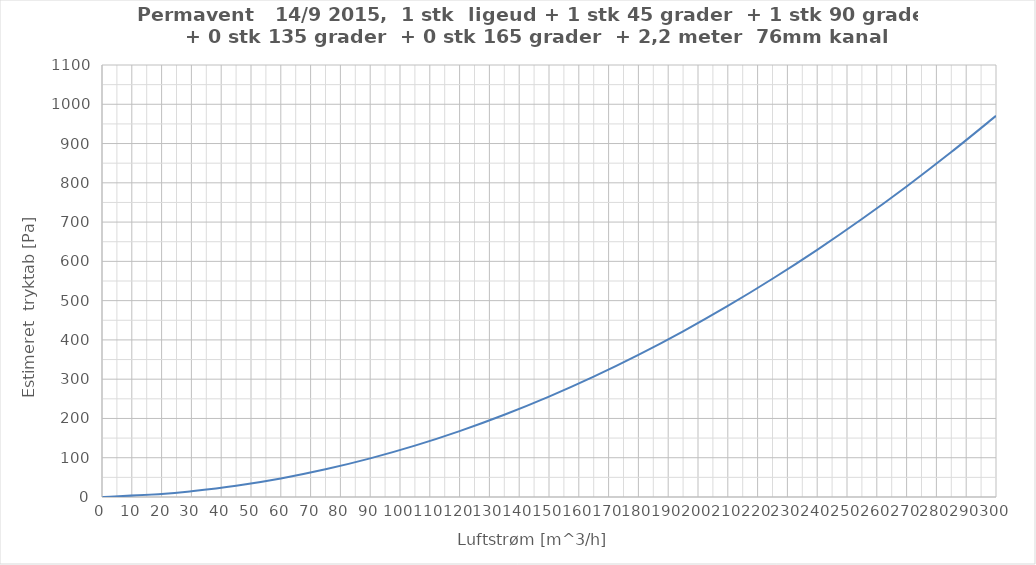
| Category | Series 0 |
|---|---|
| 0.0 | 0 |
| 20.0 | 7.552 |
| 30.0 | 14.39 |
| 45.0 | 28.473 |
| 60.0 | 47.148 |
| 75.0 | 70.416 |
| 90.0 | 98.275 |
| 105.0 | 130.727 |
| 120.0 | 167.772 |
| 135.0 | 209.408 |
| 150.0 | 255.636 |
| 165.0 | 306.457 |
| 180.0 | 361.87 |
| 195.0 | 421.875 |
| 210.0 | 486.472 |
| 225.0 | 555.662 |
| 240.0 | 629.443 |
| 255.0 | 707.817 |
| 270.0 | 790.783 |
| 285.0 | 878.341 |
| 300.0 | 970.492 |